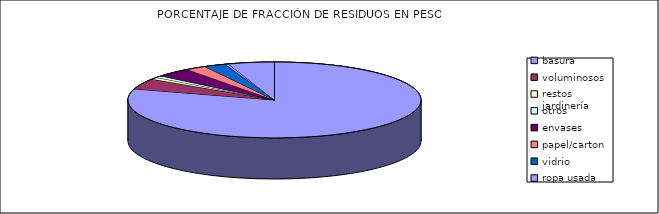
| Category | PORCENTAJE DE FRACCIÓN DE RESIDUOS EN PESO |
|---|---|
| basura | 33583.24 |
| voluminosos | 1920.4 |
| restos jardinería | 358.16 |
| otros | 338.76 |
| envases | 1655.72 |
| papel/carton | 957.13 |
| vidrio | 1026.75 |
| ropa usada | 146.25 |
| Punto Limpio | 2150.17 |